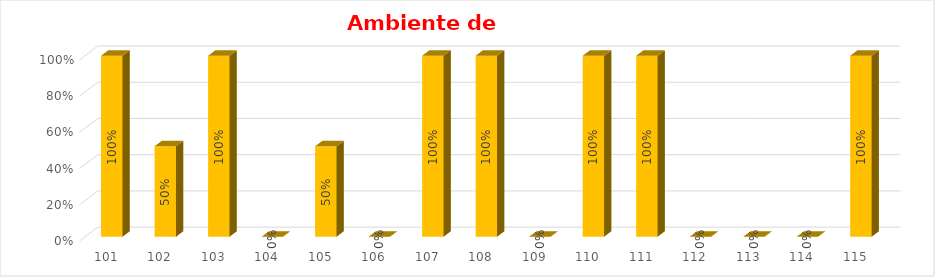
| Category | % Avance |
|---|---|
| 101.0 | 1 |
| 102.0 | 0.5 |
| 103.0 | 1 |
| 104.0 | 0 |
| 105.0 | 0.5 |
| 106.0 | 0 |
| 107.0 | 1 |
| 108.0 | 1 |
| 109.0 | 0 |
| 110.0 | 1 |
| 111.0 | 1 |
| 112.0 | 0 |
| 113.0 | 0 |
| 114.0 | 0 |
| 115.0 | 1 |